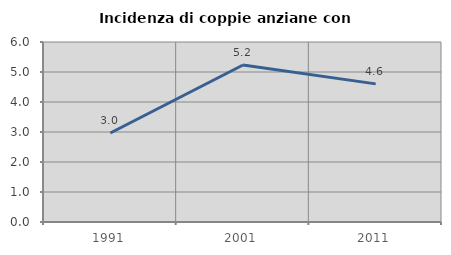
| Category | Incidenza di coppie anziane con figli |
|---|---|
| 1991.0 | 2.966 |
| 2001.0 | 5.233 |
| 2011.0 | 4.604 |